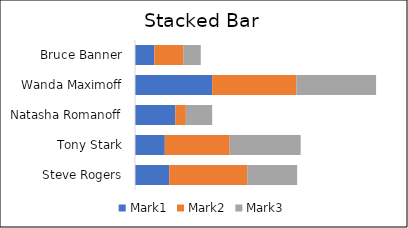
| Category | Mark1 | Mark2 | Mark3 |
|---|---|---|---|
| Steve Rogers | 39 | 89 | 57 |
| Tony Stark | 34 | 74 | 81 |
| Natasha Romanoff | 46 | 12 | 30 |
| Wanda Maximoff | 88 | 96 | 91 |
| Bruce Banner | 22 | 33 | 20 |